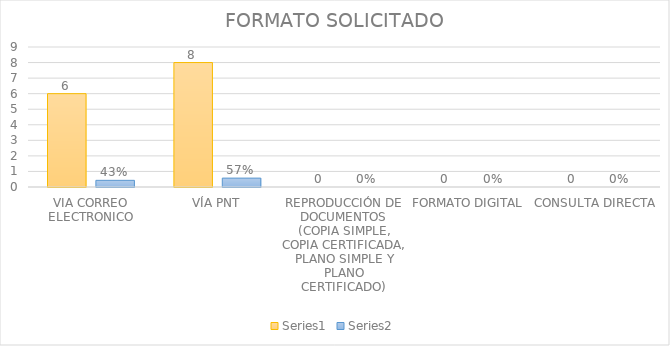
| Category | Series 3 | Series 4 |
|---|---|---|
| VIA CORREO ELECTRONICO | 6 | 0.429 |
| VÍA PNT | 8 | 0.571 |
| REPRODUCCIÓN DE DOCUMENTOS (COPIA SIMPLE, COPIA CERTIFICADA, PLANO SIMPLE Y PLANO CERTIFICADO) | 0 | 0 |
| FORMATO DIGITAL | 0 | 0 |
| CONSULTA DIRECTA | 0 | 0 |